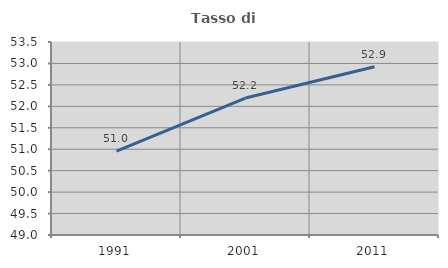
| Category | Tasso di occupazione   |
|---|---|
| 1991.0 | 50.955 |
| 2001.0 | 52.193 |
| 2011.0 | 52.924 |